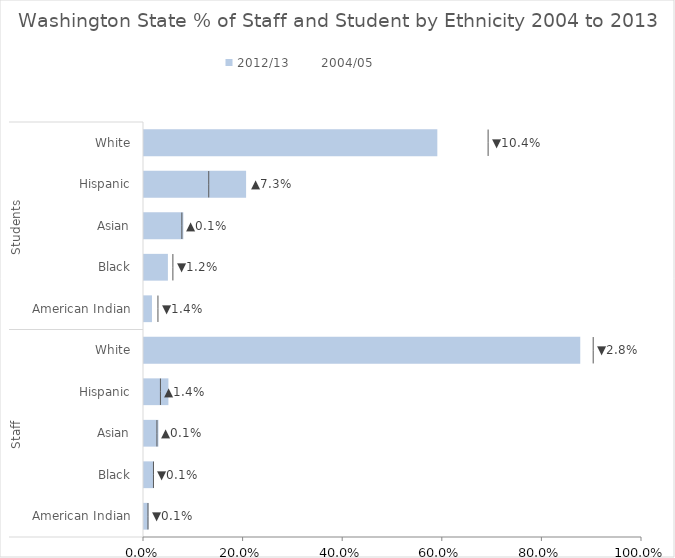
| Category | 2012/13 |
|---|---|
| 0 | 0.009 |
| 1 | 0.02 |
| 2 | 0.029 |
| 3 | 0.049 |
| 4 | 0.876 |
| 5 | 0.016 |
| 6 | 0.048 |
| 7 | 0.079 |
| 8 | 0.205 |
| 9 | 0.589 |